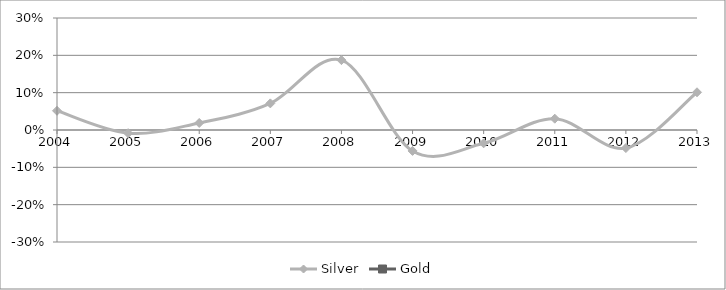
| Category | Silver |
|---|---|
| 2004.0 | 0.051 |
| 2005.0 | -0.008 |
| 2006.0 | 0.019 |
| 2007.0 | 0.071 |
| 2008.0 | 0.187 |
| 2009.0 | -0.056 |
| 2010.0 | -0.036 |
| 2011.0 | 0.03 |
| 2012.0 | -0.048 |
| 2013.0 | 0.101 |